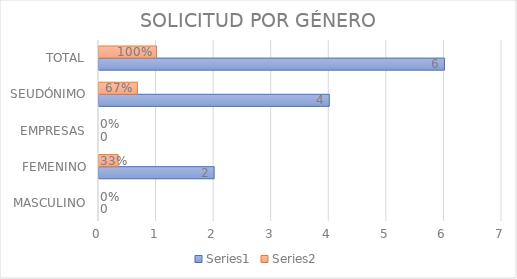
| Category | Series 0 | Series 1 |
|---|---|---|
| MASCULINO | 0 | 0 |
| FEMENINO | 2 | 0.333 |
| EMPRESAS | 0 | 0 |
| SEUDÓNIMO | 4 | 0.667 |
| TOTAL | 6 | 1 |